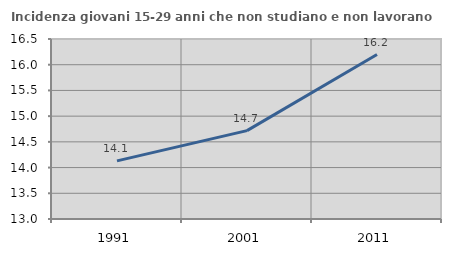
| Category | Incidenza giovani 15-29 anni che non studiano e non lavorano  |
|---|---|
| 1991.0 | 14.13 |
| 2001.0 | 14.719 |
| 2011.0 | 16.198 |